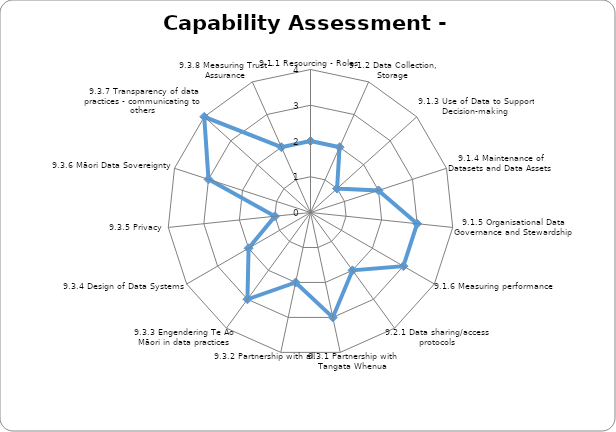
| Category | Series 0 |
|---|---|
| 9.1.1 Resourcing - Roles | 2 |
| 9.1.2 Data Collection, Storage | 2 |
| 9.1.3 Use of Data to Support Decision-making | 1 |
| 9.1.4 Maintenance of Datasets and Data Assets | 2 |
| 9.1.5 Organisational Data Governance and Stewardship | 3 |
| 9.1.6 Measuring performance | 3 |
| 9.2.1 Data sharing/access protocols | 2 |
| 9.3.1 Partnership with Tangata Whenua | 3 |
| 9.3.2 Partnership with all | 2 |
| 9.3.3 Engendering Te Ao Māori in data practices | 3 |
| 9.3.4 Design of Data Systems | 2 |
| 9.3.5 Privacy  | 1 |
| 9.3.6 Māori Data Sovereignty | 3 |
| 9.3.7 Transparency of data practices - communicating to others | 4 |
| 9.3.8 Measuring Trust - Assurance | 2 |